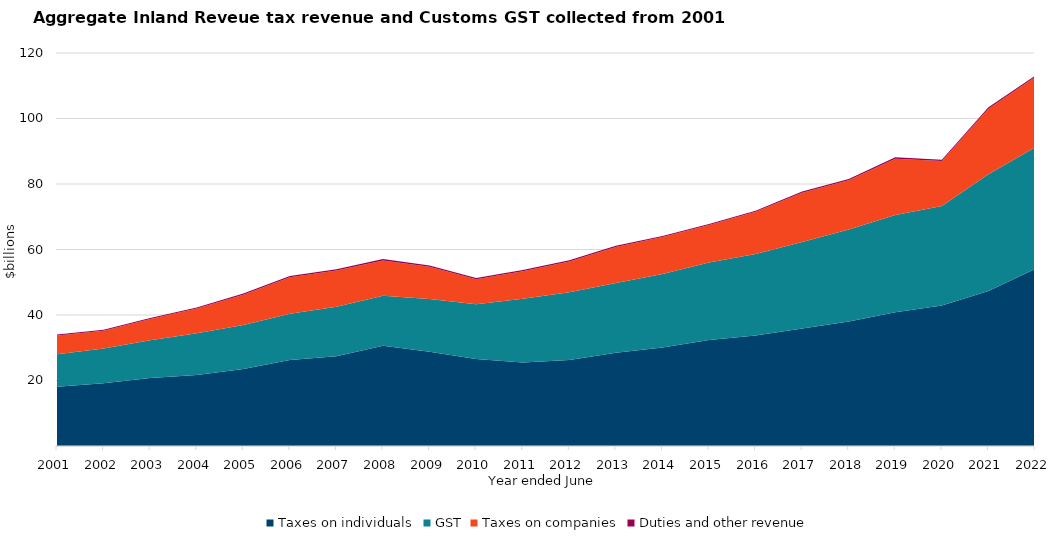
| Category | Taxes on individuals | GST | Taxes on companies | Duties and other revenue |
|---|---|---|---|---|
| 2001.0 | 18116.915 | 9886.366 | 5745.179 | 268.362 |
| 2002.0 | 19143.41 | 10644.756 | 5412.4 | 302.117 |
| 2003.0 | 20780.113 | 11525.947 | 6469.137 | 327.436 |
| 2004.0 | 21673.336 | 12775.925 | 7502.262 | 353.323 |
| 2005.0 | 23492.497 | 13430.639 | 9288.079 | 383.408 |
| 2006.0 | 26251.041 | 14133.382 | 11126.781 | 400.338 |
| 2007.0 | 27427.041 | 15105.456 | 11049.475 | 380.325 |
| 2008.0 | 30590.905 | 15299.618 | 10749.754 | 426.572 |
| 2009.0 | 28809.258 | 16106.996 | 9820.51 | 364.474 |
| 2010.0 | 26555.321 | 16727.273 | 7642.014 | 359.104 |
| 2011.0 | 25521.6 | 19461.443 | 8389.25 | 358.9 |
| 2012.0 | 26268.5 | 20646.154 | 9413.4 | 364.4 |
| 2013.0 | 28444.6 | 21356.182 | 10963.581 | 354.222 |
| 2014.0 | 30067.8 | 22416.575 | 11306.8 | 362.3 |
| 2015.0 | 32374.9 | 23677.624 | 11393.4 | 367.4 |
| 2016.0 | 33714.962 | 24901.546 | 12884.411 | 361.902 |
| 2017.0 | 35864.307 | 26390.746 | 15075.183 | 384.144 |
| 2018.0 | 38023.9 | 28108.888 | 15004.8 | 425.6 |
| 2019.0 | 40853 | 29650.711 | 17212.7 | 420.797 |
| 2020.0 | 42905.33 | 30398.616 | 13740.836 | 379.217 |
| 2021.0 | 47341.731 | 35627.691 | 20022.706 | 411.169 |
| 2022.0 | 54052.815 | 37093.677 | 21485.742 | 370.01 |